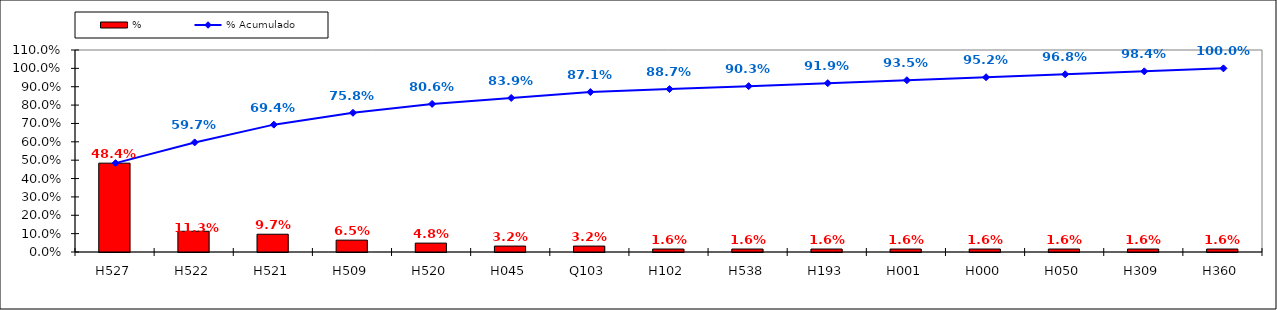
| Category | % |
|---|---|
| H527 | 0.484 |
| H522 | 0.113 |
| H521 | 0.097 |
| H509 | 0.065 |
| H520 | 0.048 |
| H045 | 0.032 |
| Q103 | 0.032 |
| H102 | 0.016 |
| H538 | 0.016 |
| H193 | 0.016 |
| H001 | 0.016 |
| H000 | 0.016 |
| H050 | 0.016 |
| H309 | 0.016 |
| H360 | 0.016 |